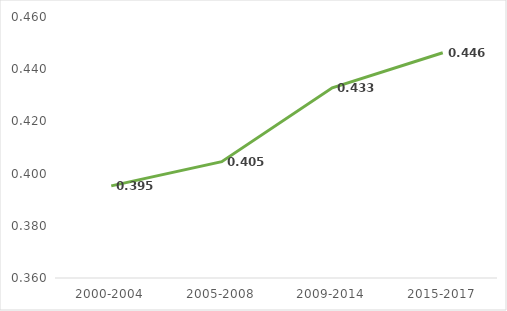
| Category | 0,395 |
|---|---|
| 2000-2004 | 0.395 |
| 2005-2008 | 0.405 |
| 2009-2014 | 0.433 |
| 2015-2017 | 0.446 |